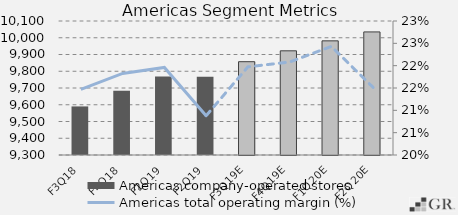
| Category | Americas company-operated stores |
|---|---|
|  F3Q18  | 9590 |
|  F4Q18  | 9684 |
|  F1Q19  | 9768 |
|  F2Q19  | 9767 |
|  F3Q19E  | 9857 |
|  F4Q19E  | 9922 |
|  F1Q20E  | 9981.5 |
|  F2Q20E  | 10034.875 |